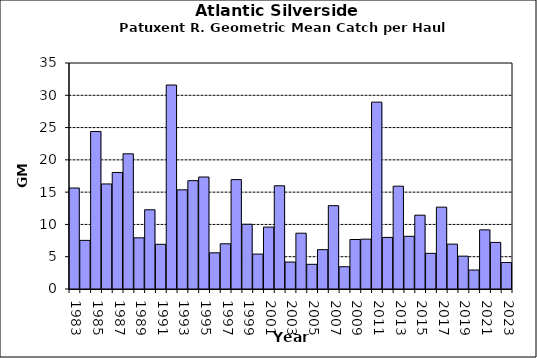
| Category | Series 0 |
|---|---|
| 1983.0 | 15.642 |
| 1984.0 | 7.529 |
| 1985.0 | 24.393 |
| 1986.0 | 16.269 |
| 1987.0 | 18.047 |
| 1988.0 | 20.935 |
| 1989.0 | 7.926 |
| 1990.0 | 12.27 |
| 1991.0 | 6.925 |
| 1992.0 | 31.59 |
| 1993.0 | 15.356 |
| 1994.0 | 16.78 |
| 1995.0 | 17.344 |
| 1996.0 | 5.604 |
| 1997.0 | 7.001 |
| 1998.0 | 16.94 |
| 1999.0 | 10.029 |
| 2000.0 | 5.407 |
| 2001.0 | 9.591 |
| 2002.0 | 15.986 |
| 2003.0 | 4.173 |
| 2004.0 | 8.64 |
| 2005.0 | 3.823 |
| 2006.0 | 6.094 |
| 2007.0 | 12.908 |
| 2008.0 | 3.45 |
| 2009.0 | 7.665 |
| 2010.0 | 7.72 |
| 2011.0 | 28.938 |
| 2012.0 | 7.987 |
| 2013.0 | 15.92 |
| 2014.0 | 8.159 |
| 2015.0 | 11.432 |
| 2016.0 | 5.52 |
| 2017.0 | 12.675 |
| 2018.0 | 6.95 |
| 2019.0 | 5.087 |
| 2020.0 | 2.94 |
| 2021.0 | 9.159 |
| 2022.0 | 7.215 |
| 2023.0 | 4.104 |